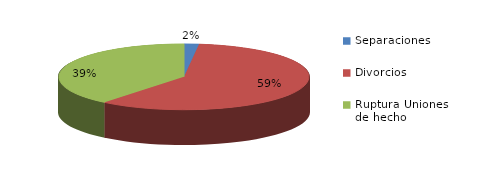
| Category | Series 0 |
|---|---|
| Separaciones | 96 |
| Divorcios | 2980 |
| Ruptura Uniones de hecho | 1980 |